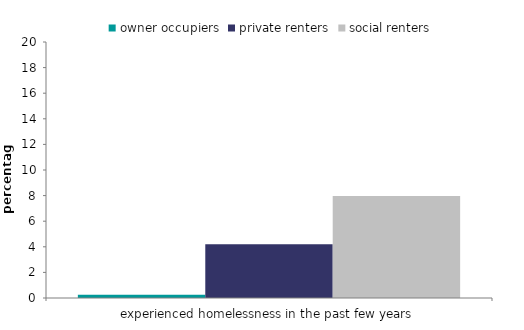
| Category | owner occupiers | private renters | social renters |
|---|---|---|---|
| experienced homelessness in the past few years | 0.262 | 4.201 | 7.967 |